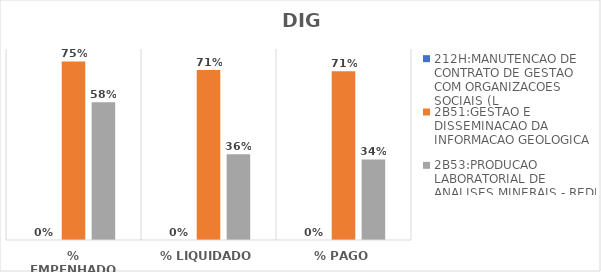
| Category | 212H:MANUTENCAO DE CONTRATO DE GESTAO COM ORGANIZACOES SOCIAIS (L | 2B51:GESTAO E DISSEMINACAO DA INFORMACAO GEOLOGICA | 2B53:PRODUCAO LABORATORIAL DE ANALISES MINERAIS - REDE LAMIN |
|---|---|---|---|
| % EMPENHADO | 0 | 0.748 | 0.577 |
| % LIQUIDADO | 0 | 0.712 | 0.36 |
| % PAGO | 0 | 0.707 | 0.337 |